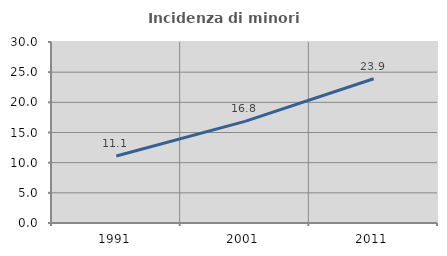
| Category | Incidenza di minori stranieri |
|---|---|
| 1991.0 | 11.111 |
| 2001.0 | 16.842 |
| 2011.0 | 23.902 |